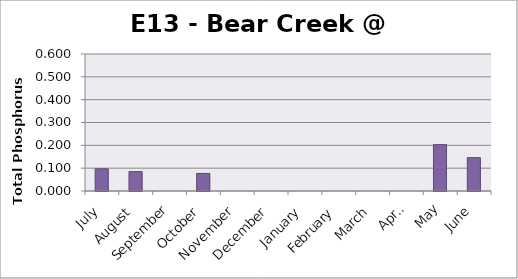
| Category | Phosphorus (mg/L) |
|---|---|
| July | 0.097 |
| August | 0.085 |
| September | 0 |
| October | 0.077 |
| November | 0 |
| December | 0 |
| January | 0 |
| February | 0 |
| March | 0 |
| April | 0 |
| May | 0.203 |
| June | 0.146 |